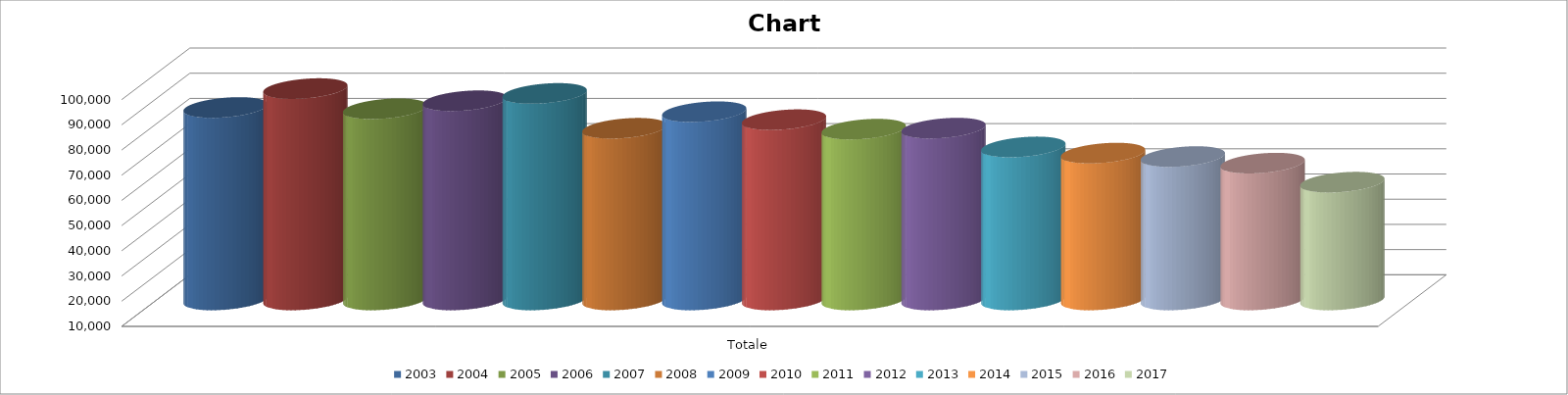
| Category | 2003 | 2004 | 2005 | 2006 | 2007 | 2008 | 2009 | 2010 | 2011 | 2012 | 2013 | 2014 | 2015 | 2016 | 2017 |
|---|---|---|---|---|---|---|---|---|---|---|---|---|---|---|---|
| Totale | 86382 | 93884 | 85876 | 89054 | 91967 | 78131 | 84702 | 81542 | 77777 | 78182 | 70729 | 68278 | 66909 | 64299 | 56737 |